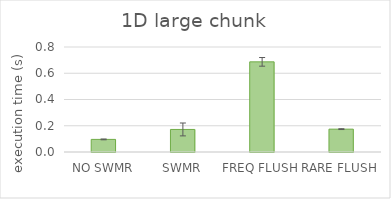
| Category | 1D large chunk |
|---|---|
| NO SWMR | 0.096 |
| SWMR | 0.172 |
| FREQ FLUSH | 0.687 |
| RARE FLUSH | 0.174 |